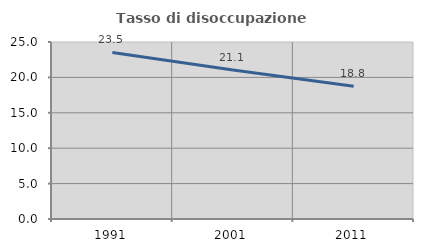
| Category | Tasso di disoccupazione giovanile  |
|---|---|
| 1991.0 | 23.529 |
| 2001.0 | 21.053 |
| 2011.0 | 18.75 |